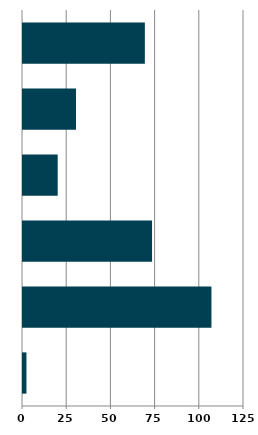
| Category | Series 0 |
|---|---|
| 0 | 1.95 |
| 1 | 106.585 |
| 2 | 72.998 |
| 3 | 19.624 |
| 4 | 29.988 |
| 5 | 68.922 |